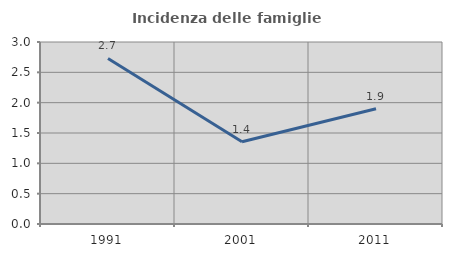
| Category | Incidenza delle famiglie numerose |
|---|---|
| 1991.0 | 2.73 |
| 2001.0 | 1.355 |
| 2011.0 | 1.899 |